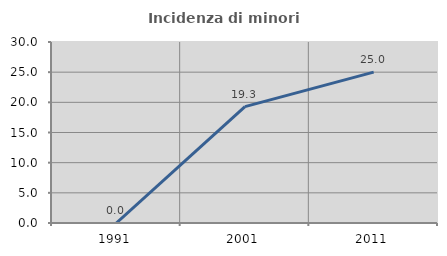
| Category | Incidenza di minori stranieri |
|---|---|
| 1991.0 | 0 |
| 2001.0 | 19.286 |
| 2011.0 | 25 |